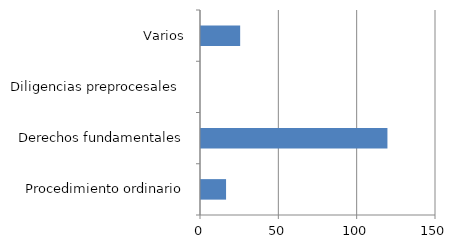
| Category | Series 0 |
|---|---|
| Procedimiento ordinario | 16 |
| Derechos fundamentales | 119 |
| Diligencias preprocesales  | 0 |
| Varios | 25 |